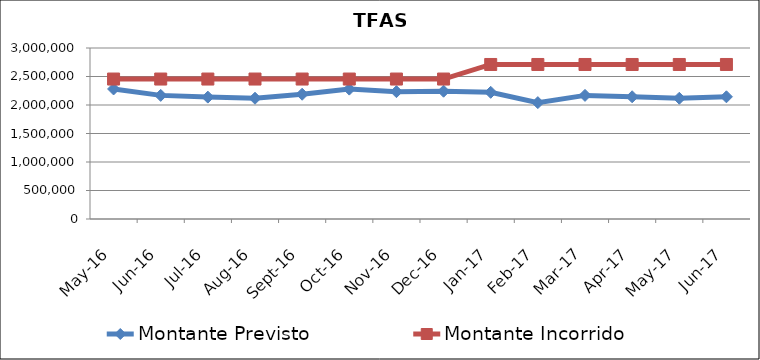
| Category | Montante Previsto | Montante Incorrido |
|---|---|---|
| 2016-05-01 | 2281269.051 | 2455380.65 |
| 2016-06-01 | 2168771.268 | 2455380.65 |
| 2016-07-01 | 2138194.238 | 2455380.65 |
| 2016-08-01 | 2118638.76 | 2455380.65 |
| 2016-09-01 | 2188943.937 | 2455380.65 |
| 2016-10-01 | 2278604.275 | 2455380.65 |
| 2016-11-01 | 2233973.164 | 2455380.65 |
| 2016-12-01 | 2241506.837 | 2455380.65 |
| 2017-01-01 | 2222753.912 | 2710818.738 |
| 2017-02-01 | 2041687.616 | 2710818.738 |
| 2017-03-01 | 2168649.455 | 2710818.738 |
| 2017-04-01 | 2144363.661 | 2710818.738 |
| 2017-05-01 | 2118233.577 | 2710818.738 |
| 2017-06-01 | 2143748.898 | 2710818.738 |